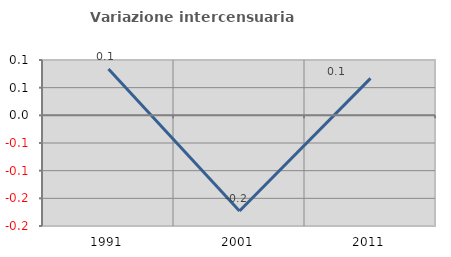
| Category | Variazione intercensuaria annua |
|---|---|
| 1991.0 | 0.084 |
| 2001.0 | -0.173 |
| 2011.0 | 0.067 |